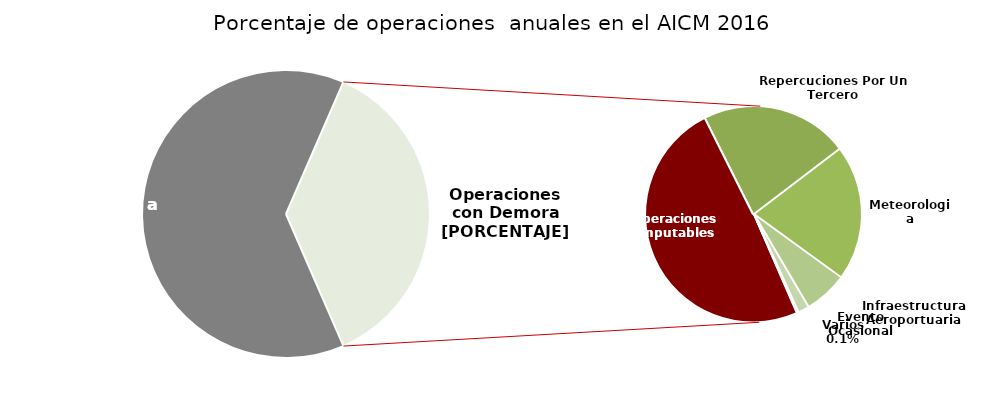
| Category | Series 0 |
|---|---|
| Operaciones a Tiempo | 209364 |
| Operaciones Imputables | 60262 |
| Repercuciones Por Un Tercero | 27026 |
| Meteorologia | 24971 |
| Infraestructura Aeroportuaria | 8037 |
| Evento Ocasional | 2046 |
| Varios | 311 |